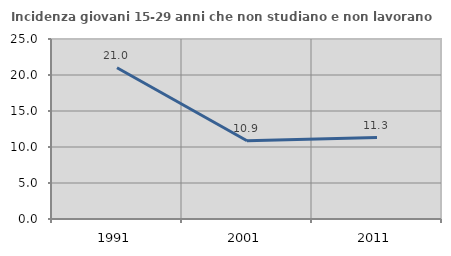
| Category | Incidenza giovani 15-29 anni che non studiano e non lavorano  |
|---|---|
| 1991.0 | 21 |
| 2001.0 | 10.87 |
| 2011.0 | 11.304 |